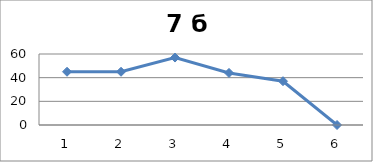
| Category | Series 0 |
|---|---|
| 0 | 45 |
| 1 | 45 |
| 2 | 57 |
| 3 | 44 |
| 4 | 37 |
| 5 | 0 |